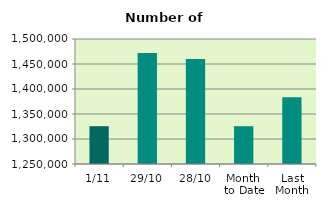
| Category | Series 0 |
|---|---|
| 1/11 | 1325572 |
| 29/10 | 1471802 |
| 28/10 | 1459906 |
| Month 
to Date | 1325572 |
| Last
Month | 1383348.571 |